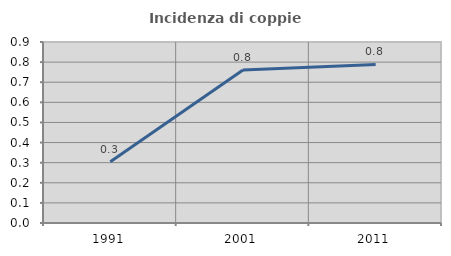
| Category | Incidenza di coppie miste |
|---|---|
| 1991.0 | 0.305 |
| 2001.0 | 0.761 |
| 2011.0 | 0.788 |